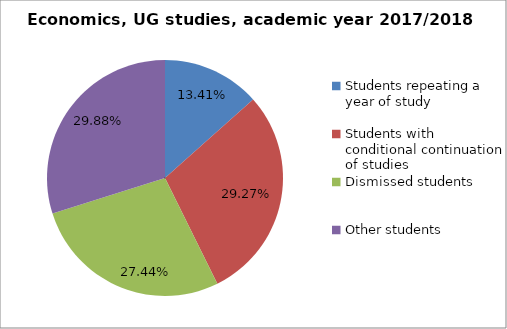
| Category | Series 0 |
|---|---|
| Students repeating a year of study | 44 |
| Students with conditional continuation of studies | 96 |
| Dismissed students | 90 |
| Other students | 98 |